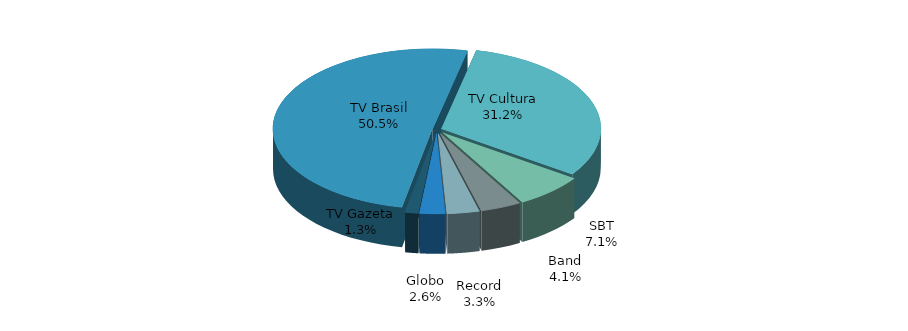
| Category | Series 0 |
|---|---|
| TV Brasil | 0.505 |
| TV Cultura | 0.312 |
| SBT | 0.071 |
| Band | 0.041 |
| Record | 0.033 |
| Globo | 0.026 |
| TV Gazeta | 0.013 |